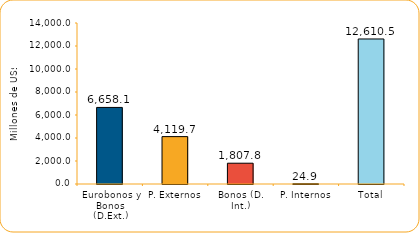
| Category | Series 1 |
|---|---|
| Eurobonos y Bonos (D.Ext.) | 6658.1 |
| P. Externos | 4119.7 |
| Bonos (D. Int.) | 1807.8 |
| P. Internos | 24.9 |
| Total | 12610.5 |